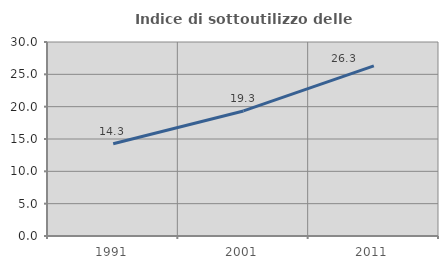
| Category | Indice di sottoutilizzo delle abitazioni  |
|---|---|
| 1991.0 | 14.266 |
| 2001.0 | 19.342 |
| 2011.0 | 26.301 |